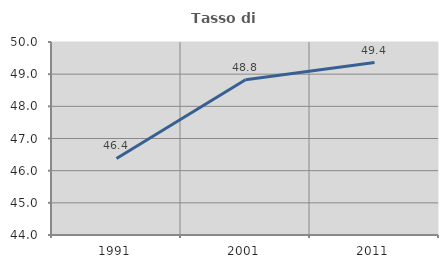
| Category | Tasso di occupazione   |
|---|---|
| 1991.0 | 46.38 |
| 2001.0 | 48.825 |
| 2011.0 | 49.361 |